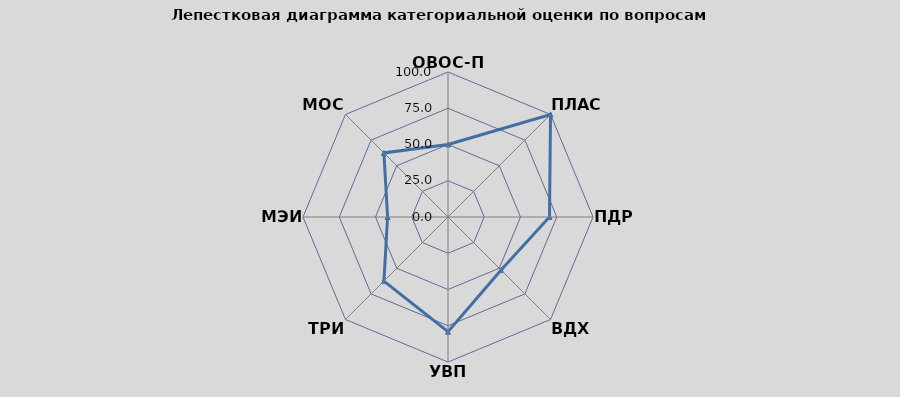
| Category | B1 |
|---|---|
| ОВОС-ПЗ | 50 |
| ПЛАС | 100 |
| ПДР | 70 |
| ВДХ | 51.786 |
| УВП | 79.167 |
| ТРИ | 62.5 |
| МЭИ | 41.667 |
| MОС | 62.5 |